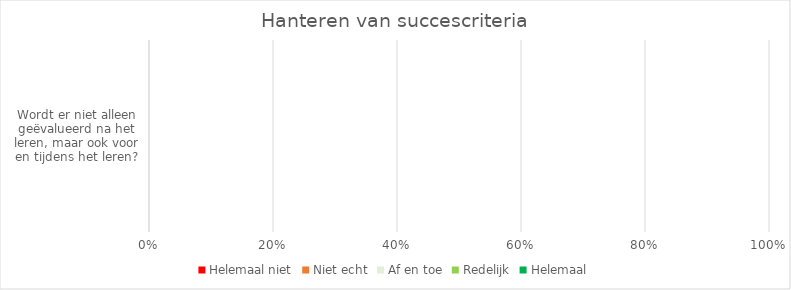
| Category | Helemaal niet | Niet echt | Af en toe | Redelijk | Helemaal |
|---|---|---|---|---|---|
| Wordt er niet alleen geëvalueerd na het leren, maar ook voor en tijdens het leren? | 0 | 0 | 0 | 0 | 0 |